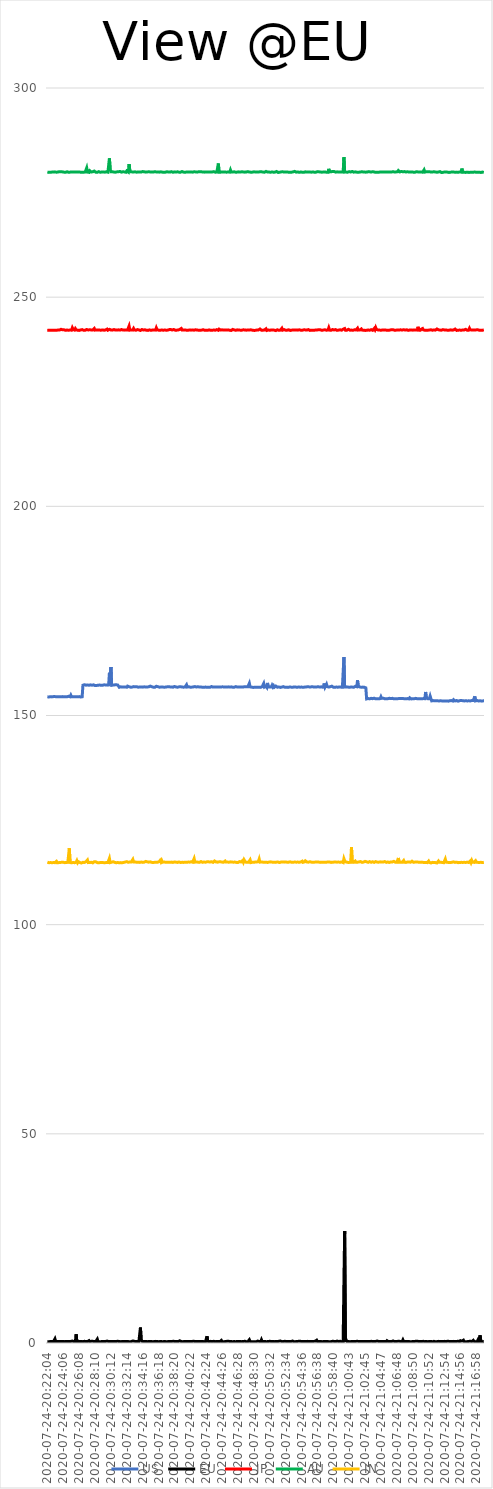
| Category | US | EU | JP | AU | IN |
|---|---|---|---|---|---|
| 2020-07-24-20:22:04 | 154.469 | 0.34 | 242.092 | 279.919 | 114.947 |
| 2020-07-24-20:22:10 | 154.546 | 0.378 | 242.149 | 279.965 | 114.862 |
| 2020-07-24-20:22:16 | 154.424 | 0.3 | 242.091 | 279.829 | 114.811 |
| 2020-07-24-20:22:22 | 154.582 | 0.306 | 242.114 | 279.846 | 114.849 |
| 2020-07-24-20:22:27 | 154.502 | 0.36 | 242.067 | 279.843 | 114.844 |
| 2020-07-24-20:22:33 | 154.479 | 0.297 | 242.162 | 279.893 | 114.92 |
| 2020-07-24-20:22:39 | 154.449 | 0.341 | 242.063 | 279.906 | 114.818 |
| 2020-07-24-20:22:45 | 154.559 | 0.316 | 242.123 | 279.864 | 114.794 |
| 2020-07-24-20:22:51 | 154.513 | 0.324 | 242.114 | 279.902 | 114.839 |
| 2020-07-24-20:22:57 | 154.743 | 0.363 | 242.196 | 279.869 | 114.819 |
| 2020-07-24-20:23:02 | 154.519 | 0.985 | 242.112 | 279.949 | 114.826 |
| 2020-07-24-20:23:08 | 154.496 | 0.32 | 242.196 | 279.995 | 114.856 |
| 2020-07-24-20:23:14 | 154.482 | 0.316 | 242.075 | 279.87 | 115.137 |
| 2020-07-24-20:23:20 | 154.445 | 0.356 | 242.063 | 279.885 | 114.801 |
| 2020-07-24-20:23:26 | 154.478 | 0.338 | 242.147 | 279.923 | 114.861 |
| 2020-07-24-20:23:31 | 154.446 | 0.338 | 242.252 | 279.978 | 114.831 |
| 2020-07-24-20:23:37 | 154.495 | 0.301 | 242.141 | 279.997 | 114.992 |
| 2020-07-24-20:23:43 | 154.528 | 0.337 | 242.167 | 279.948 | 114.867 |
| 2020-07-24-20:23:49 | 154.493 | 0.338 | 242.32 | 279.991 | 114.87 |
| 2020-07-24-20:23:55 | 154.533 | 0.365 | 242.097 | 279.842 | 114.912 |
| 2020-07-24-20:24:00 | 154.513 | 0.33 | 242.21 | 279.944 | 114.804 |
| 2020-07-24-20:24:06 | 154.57 | 0.351 | 242.056 | 279.991 | 114.912 |
| 2020-07-24-20:24:12 | 154.488 | 0.405 | 242.198 | 279.886 | 114.877 |
| 2020-07-24-20:24:18 | 154.508 | 0.324 | 242.107 | 279.926 | 114.821 |
| 2020-07-24-20:24:24 | 154.491 | 0.313 | 242.072 | 279.84 | 114.858 |
| 2020-07-24-20:24:29 | 154.508 | 0.371 | 242.253 | 279.937 | 114.862 |
| 2020-07-24-20:24:35 | 154.484 | 0.314 | 242.147 | 279.982 | 114.824 |
| 2020-07-24-20:24:41 | 154.561 | 0.351 | 242.186 | 279.889 | 114.902 |
| 2020-07-24-20:24:47 | 154.597 | 0.38 | 242.09 | 279.853 | 114.911 |
| 2020-07-24-20:24:53 | 154.565 | 0.346 | 242.155 | 279.854 | 118.265 |
| 2020-07-24-20:24:58 | 154.487 | 0.388 | 242.142 | 279.889 | 114.867 |
| 2020-07-24-20:25:04 | 154.866 | 0.374 | 242.244 | 279.959 | 114.802 |
| 2020-07-24-20:25:10 | 154.472 | 0.35 | 242.109 | 279.918 | 114.787 |
| 2020-07-24-20:25:16 | 154.549 | 0.468 | 242.67 | 279.9 | 114.889 |
| 2020-07-24-20:25:22 | 154.461 | 0.343 | 242.309 | 279.939 | 114.867 |
| 2020-07-24-20:25:28 | 154.558 | 0.341 | 242.174 | 279.914 | 114.81 |
| 2020-07-24-20:25:33 | 154.485 | 0.339 | 242.133 | 279.897 | 114.815 |
| 2020-07-24-20:25:39 | 154.51 | 0.368 | 242.482 | 280.017 | 114.869 |
| 2020-07-24-20:25:45 | 154.481 | 2.091 | 242.21 | 279.905 | 114.904 |
| 2020-07-24-20:25:51 | 154.575 | 0.363 | 242.052 | 279.892 | 115.296 |
| 2020-07-24-20:25:57 | 154.456 | 0.331 | 242.1 | 279.905 | 114.808 |
| 2020-07-24-20:26:02 | 154.509 | 0.336 | 242.186 | 279.9 | 115.066 |
| 2020-07-24-20:26:08 | 154.516 | 0.341 | 242.053 | 279.918 | 114.863 |
| 2020-07-24-20:26:14 | 154.527 | 0.368 | 242.067 | 279.914 | 114.848 |
| 2020-07-24-20:26:20 | 154.429 | 0.362 | 242.163 | 279.87 | 114.835 |
| 2020-07-24-20:26:26 | 154.463 | 0.354 | 242.123 | 279.911 | 114.742 |
| 2020-07-24-20:26:31 | 154.48 | 0.356 | 242.247 | 279.852 | 114.902 |
| 2020-07-24-20:26:37 | 157.24 | 0.323 | 242.077 | 279.895 | 114.898 |
| 2020-07-24-20:26:43 | 157.277 | 0.383 | 242.073 | 279.863 | 114.855 |
| 2020-07-24-20:26:49 | 157.356 | 0.399 | 242.227 | 279.871 | 114.878 |
| 2020-07-24-20:26:55 | 157.349 | 0.363 | 242.088 | 279.912 | 114.838 |
| 2020-07-24-20:27:00 | 157.238 | 0.366 | 242.115 | 279.888 | 115.037 |
| 2020-07-24-20:27:06 | 157.264 | 0.355 | 242.271 | 280.9 | 114.837 |
| 2020-07-24-20:27:12 | 157.307 | 0.324 | 242.21 | 279.901 | 115.468 |
| 2020-07-24-20:27:18 | 157.321 | 0.316 | 242.153 | 279.828 | 114.84 |
| 2020-07-24-20:27:24 | 157.229 | 0.557 | 242.105 | 279.837 | 114.885 |
| 2020-07-24-20:27:29 | 157.227 | 0.317 | 242.214 | 280.222 | 114.862 |
| 2020-07-24-20:27:35 | 157.319 | 0.345 | 242.086 | 279.994 | 114.813 |
| 2020-07-24-20:27:41 | 157.358 | 0.4 | 242.151 | 279.927 | 114.913 |
| 2020-07-24-20:27:47 | 157.236 | 0.359 | 242.155 | 279.905 | 114.778 |
| 2020-07-24-20:27:53 | 157.289 | 0.398 | 242.143 | 279.968 | 114.779 |
| 2020-07-24-20:27:59 | 157.327 | 0.318 | 242.13 | 279.897 | 114.847 |
| 2020-07-24-20:28:04 | 157.246 | 0.363 | 242.509 | 280.145 | 115.057 |
| 2020-07-24-20:28:10 | 157.156 | 0.354 | 242.125 | 279.917 | 114.839 |
| 2020-07-24-20:28:16 | 157.301 | 0.357 | 242.139 | 279.87 | 115.029 |
| 2020-07-24-20:28:22 | 157.182 | 0.386 | 242.148 | 279.941 | 114.843 |
| 2020-07-24-20:28:28 | 157.22 | 0.919 | 242.151 | 279.859 | 114.83 |
| 2020-07-24-20:28:33 | 157.243 | 0.31 | 242.129 | 279.913 | 114.842 |
| 2020-07-24-20:28:39 | 157.299 | 0.323 | 242.091 | 280.001 | 114.786 |
| 2020-07-24-20:28:45 | 157.276 | 0.317 | 242.13 | 279.887 | 114.892 |
| 2020-07-24-20:28:51 | 157.292 | 0.379 | 242.12 | 279.862 | 114.86 |
| 2020-07-24-20:28:57 | 157.232 | 0.329 | 242.107 | 279.929 | 114.833 |
| 2020-07-24-20:29:02 | 157.217 | 0.376 | 242.176 | 279.919 | 114.876 |
| 2020-07-24-20:29:08 | 157.226 | 0.331 | 242.164 | 279.964 | 114.853 |
| 2020-07-24-20:29:14 | 157.215 | 0.383 | 242.108 | 279.91 | 114.833 |
| 2020-07-24-20:29:20 | 157.337 | 0.338 | 242.103 | 279.862 | 114.825 |
| 2020-07-24-20:29:26 | 157.29 | 0.386 | 242.158 | 279.882 | 114.812 |
| 2020-07-24-20:29:32 | 157.297 | 0.37 | 242.162 | 279.881 | 114.952 |
| 2020-07-24-20:29:37 | 157.304 | 0.365 | 242.162 | 279.969 | 114.857 |
| 2020-07-24-20:29:43 | 157.261 | 0.459 | 242.365 | 279.953 | 114.813 |
| 2020-07-24-20:29:49 | 157.365 | 0.354 | 242.107 | 279.881 | 114.85 |
| 2020-07-24-20:29:55 | 157.306 | 0.343 | 242.171 | 279.961 | 114.836 |
| 2020-07-24-20:30:01 | 160.214 | 0.376 | 242.313 | 283.184 | 115.847 |
| 2020-07-24-20:30:06 | 157.228 | 0.385 | 242.179 | 280.537 | 114.838 |
| 2020-07-24-20:30:12 | 161.601 | 0.338 | 242.143 | 279.981 | 114.881 |
| 2020-07-24-20:30:18 | 157.216 | 0.376 | 242.109 | 280.061 | 114.937 |
| 2020-07-24-20:30:24 | 157.282 | 0.311 | 242.123 | 279.979 | 114.885 |
| 2020-07-24-20:30:30 | 157.279 | 0.34 | 242.063 | 279.89 | 115.046 |
| 2020-07-24-20:30:35 | 157.268 | 0.334 | 242.265 | 279.895 | 114.842 |
| 2020-07-24-20:30:41 | 157.321 | 0.358 | 242.072 | 279.94 | 114.89 |
| 2020-07-24-20:30:47 | 157.346 | 0.376 | 242.124 | 279.881 | 114.858 |
| 2020-07-24-20:30:53 | 157.346 | 0.371 | 242.302 | 280.095 | 114.806 |
| 2020-07-24-20:30:59 | 157.319 | 0.408 | 242.147 | 279.956 | 114.79 |
| 2020-07-24-20:31:04 | 157.29 | 0.412 | 242.285 | 280.113 | 114.856 |
| 2020-07-24-20:31:10 | 157.037 | 0.466 | 242.191 | 279.977 | 114.874 |
| 2020-07-24-20:31:16 | 156.738 | 0.341 | 242.16 | 279.894 | 114.795 |
| 2020-07-24-20:31:22 | 156.733 | 0.388 | 242.13 | 280.047 | 114.895 |
| 2020-07-24-20:31:28 | 156.855 | 0.326 | 242.055 | 279.919 | 114.834 |
| 2020-07-24-20:31:34 | 156.828 | 0.327 | 242.257 | 279.889 | 114.924 |
| 2020-07-24-20:31:39 | 156.788 | 0.332 | 242.209 | 279.997 | 114.816 |
| 2020-07-24-20:31:45 | 156.781 | 0.289 | 242.149 | 279.982 | 114.845 |
| 2020-07-24-20:31:51 | 156.816 | 0.345 | 242.18 | 279.9 | 114.888 |
| 2020-07-24-20:31:57 | 156.74 | 0.33 | 242.12 | 279.931 | 114.901 |
| 2020-07-24-20:32:03 | 156.829 | 0.362 | 242.142 | 279.906 | 114.973 |
| 2020-07-24-20:32:08 | 156.804 | 0.335 | 242.132 | 279.857 | 114.933 |
| 2020-07-24-20:32:14 | 156.759 | 0.339 | 242.192 | 280.185 | 115.064 |
| 2020-07-24-20:32:20 | 157.017 | 0.311 | 242.131 | 279.979 | 114.96 |
| 2020-07-24-20:32:26 | 156.915 | 0.339 | 242.075 | 279.913 | 114.909 |
| 2020-07-24-20:32:32 | 156.88 | 0.426 | 243.077 | 281.805 | 114.931 |
| 2020-07-24-20:32:37 | 156.726 | 0.289 | 242.118 | 280.253 | 114.976 |
| 2020-07-24-20:32:43 | 156.778 | 0.317 | 242.154 | 279.979 | 114.932 |
| 2020-07-24-20:32:49 | 156.792 | 0.341 | 242.175 | 279.901 | 115.001 |
| 2020-07-24-20:32:55 | 156.784 | 0.296 | 242.082 | 279.943 | 114.943 |
| 2020-07-24-20:33:01 | 156.846 | 0.49 | 242.138 | 280.097 | 115.6 |
| 2020-07-24-20:33:07 | 156.905 | 0.36 | 242.507 | 279.932 | 114.992 |
| 2020-07-24-20:33:12 | 156.823 | 0.394 | 242.179 | 280.018 | 114.9 |
| 2020-07-24-20:33:18 | 156.875 | 0.387 | 242.194 | 279.961 | 114.999 |
| 2020-07-24-20:33:24 | 156.753 | 0.338 | 242.091 | 279.93 | 114.906 |
| 2020-07-24-20:33:30 | 156.898 | 0.366 | 242.185 | 279.876 | 114.907 |
| 2020-07-24-20:33:36 | 156.781 | 0.332 | 242.254 | 279.922 | 114.913 |
| 2020-07-24-20:33:41 | 156.771 | 0.341 | 242.122 | 279.914 | 114.934 |
| 2020-07-24-20:33:47 | 156.794 | 0.355 | 242.161 | 279.933 | 114.884 |
| 2020-07-24-20:33:53 | 156.799 | 0.354 | 242.037 | 279.925 | 114.886 |
| 2020-07-24-20:33:59 | 156.846 | 3.688 | 242.036 | 279.932 | 114.991 |
| 2020-07-24-20:34:05 | 156.832 | 0.733 | 242.152 | 279.908 | 114.969 |
| 2020-07-24-20:34:10 | 156.805 | 0.394 | 242.262 | 279.97 | 114.952 |
| 2020-07-24-20:34:16 | 156.781 | 0.387 | 242.18 | 280.028 | 114.894 |
| 2020-07-24-20:34:22 | 156.851 | 0.372 | 242.144 | 279.88 | 114.998 |
| 2020-07-24-20:34:28 | 156.855 | 0.303 | 242.095 | 279.974 | 114.944 |
| 2020-07-24-20:34:34 | 156.817 | 0.364 | 242.199 | 279.904 | 114.95 |
| 2020-07-24-20:34:39 | 156.795 | 0.305 | 242.144 | 279.889 | 115.117 |
| 2020-07-24-20:34:45 | 156.817 | 0.34 | 242.076 | 279.982 | 114.948 |
| 2020-07-24-20:34:51 | 156.821 | 0.377 | 242.097 | 279.932 | 115.021 |
| 2020-07-24-20:34:57 | 156.8 | 0.321 | 242.058 | 279.947 | 114.91 |
| 2020-07-24-20:35:03 | 156.855 | 0.443 | 242.076 | 279.982 | 114.939 |
| 2020-07-24-20:35:09 | 156.845 | 0.382 | 242.177 | 279.897 | 114.929 |
| 2020-07-24-20:35:14 | 157.024 | 0.308 | 242.016 | 279.923 | 115.018 |
| 2020-07-24-20:35:20 | 156.819 | 0.356 | 242.069 | 279.906 | 114.916 |
| 2020-07-24-20:35:26 | 156.868 | 0.402 | 242.221 | 279.909 | 114.892 |
| 2020-07-24-20:35:32 | 156.87 | 0.322 | 242.151 | 279.864 | 115.035 |
| 2020-07-24-20:35:38 | 156.774 | 0.372 | 242.208 | 279.911 | 114.868 |
| 2020-07-24-20:35:43 | 156.787 | 0.332 | 242.159 | 279.884 | 115.093 |
| 2020-07-24-20:35:49 | 156.741 | 0.353 | 242.101 | 279.993 | 114.904 |
| 2020-07-24-20:35:55 | 156.817 | 0.388 | 242.125 | 279.885 | 114.967 |
| 2020-07-24-20:36:01 | 156.988 | 0.392 | 242.668 | 279.929 | 114.947 |
| 2020-07-24-20:36:07 | 156.814 | 0.351 | 242.236 | 279.89 | 114.965 |
| 2020-07-24-20:36:12 | 156.887 | 0.383 | 242.169 | 279.927 | 114.939 |
| 2020-07-24-20:36:18 | 156.825 | 0.318 | 242.108 | 279.858 | 114.995 |
| 2020-07-24-20:36:24 | 156.768 | 0.312 | 242.109 | 279.885 | 115.106 |
| 2020-07-24-20:36:30 | 156.834 | 0.343 | 242.094 | 279.945 | 115.352 |
| 2020-07-24-20:36:36 | 156.792 | 0.371 | 242.125 | 279.962 | 114.997 |
| 2020-07-24-20:36:42 | 156.837 | 0.333 | 242.153 | 279.883 | 115.356 |
| 2020-07-24-20:36:47 | 156.815 | 0.325 | 242.105 | 279.89 | 114.904 |
| 2020-07-24-20:36:53 | 156.788 | 0.314 | 242.102 | 279.914 | 115.01 |
| 2020-07-24-20:36:59 | 156.771 | 0.352 | 242.089 | 279.865 | 114.988 |
| 2020-07-24-20:37:05 | 156.831 | 0.38 | 242.138 | 279.941 | 114.944 |
| 2020-07-24-20:37:11 | 156.785 | 0.412 | 242.116 | 279.876 | 114.927 |
| 2020-07-24-20:37:16 | 156.846 | 0.307 | 242.111 | 279.891 | 114.958 |
| 2020-07-24-20:37:22 | 156.846 | 0.302 | 242.161 | 279.983 | 114.892 |
| 2020-07-24-20:37:28 | 156.843 | 0.328 | 242.123 | 279.921 | 114.929 |
| 2020-07-24-20:37:34 | 156.883 | 0.296 | 242.139 | 279.922 | 114.916 |
| 2020-07-24-20:37:40 | 156.837 | 0.333 | 242.242 | 279.915 | 115.153 |
| 2020-07-24-20:37:45 | 156.842 | 0.339 | 242.145 | 279.9 | 114.91 |
| 2020-07-24-20:37:51 | 156.802 | 0.349 | 242.273 | 279.911 | 114.86 |
| 2020-07-24-20:37:57 | 156.838 | 0.395 | 242.146 | 280 | 114.953 |
| 2020-07-24-20:38:03 | 156.862 | 0.383 | 242.15 | 279.899 | 115.06 |
| 2020-07-24-20:38:09 | 156.77 | 0.305 | 242.222 | 279.85 | 114.88 |
| 2020-07-24-20:38:14 | 156.819 | 0.404 | 242.274 | 279.911 | 114.957 |
| 2020-07-24-20:38:20 | 156.933 | 0.347 | 242.088 | 279.95 | 114.976 |
| 2020-07-24-20:38:26 | 156.91 | 0.32 | 242.111 | 279.919 | 115.048 |
| 2020-07-24-20:38:32 | 156.825 | 0.333 | 242.057 | 279.898 | 114.942 |
| 2020-07-24-20:38:38 | 156.795 | 0.374 | 242.115 | 279.965 | 114.987 |
| 2020-07-24-20:38:44 | 156.756 | 0.445 | 242.206 | 279.967 | 114.88 |
| 2020-07-24-20:38:49 | 156.88 | 0.334 | 242.16 | 279.99 | 114.913 |
| 2020-07-24-20:38:55 | 156.85 | 0.341 | 242.231 | 279.883 | 114.994 |
| 2020-07-24-20:39:01 | 156.817 | 0.535 | 242.288 | 280.087 | 114.916 |
| 2020-07-24-20:39:07 | 156.884 | 0.349 | 242.101 | 279.875 | 114.875 |
| 2020-07-24-20:39:13 | 156.821 | 0.351 | 242.512 | 279.881 | 115.071 |
| 2020-07-24-20:39:18 | 156.806 | 0.354 | 242.169 | 280.035 | 114.898 |
| 2020-07-24-20:39:24 | 156.827 | 0.316 | 242.11 | 279.895 | 114.912 |
| 2020-07-24-20:39:30 | 156.77 | 0.43 | 242.176 | 279.889 | 114.884 |
| 2020-07-24-20:39:36 | 156.839 | 0.354 | 242.214 | 279.892 | 114.944 |
| 2020-07-24-20:39:42 | 156.817 | 0.298 | 242.162 | 279.857 | 114.939 |
| 2020-07-24-20:39:47 | 156.793 | 0.333 | 242.07 | 280.027 | 114.948 |
| 2020-07-24-20:39:53 | 157.349 | 0.294 | 242.106 | 279.922 | 114.895 |
| 2020-07-24-20:39:59 | 156.799 | 0.344 | 242.175 | 279.894 | 114.913 |
| 2020-07-24-20:40:05 | 156.9 | 0.375 | 242.108 | 279.917 | 114.961 |
| 2020-07-24-20:40:11 | 156.869 | 0.343 | 242.184 | 279.918 | 114.966 |
| 2020-07-24-20:40:16 | 156.846 | 0.32 | 242.147 | 279.92 | 114.944 |
| 2020-07-24-20:40:22 | 156.769 | 0.335 | 242.076 | 279.91 | 114.961 |
| 2020-07-24-20:40:28 | 156.816 | 0.332 | 242.117 | 279.897 | 115.032 |
| 2020-07-24-20:40:34 | 156.783 | 0.346 | 242.146 | 279.907 | 114.935 |
| 2020-07-24-20:40:40 | 156.85 | 0.453 | 242.151 | 279.888 | 114.925 |
| 2020-07-24-20:40:46 | 156.837 | 0.432 | 242.144 | 279.917 | 114.985 |
| 2020-07-24-20:40:51 | 156.806 | 0.379 | 242.109 | 279.97 | 115.801 |
| 2020-07-24-20:40:57 | 156.915 | 0.354 | 242.25 | 279.93 | 114.945 |
| 2020-07-24-20:41:03 | 156.802 | 0.42 | 242.209 | 279.944 | 114.977 |
| 2020-07-24-20:41:09 | 156.815 | 0.357 | 242.174 | 279.914 | 114.991 |
| 2020-07-24-20:41:15 | 156.783 | 0.366 | 242.135 | 279.891 | 114.999 |
| 2020-07-24-20:41:20 | 156.871 | 0.368 | 242.186 | 279.952 | 114.939 |
| 2020-07-24-20:41:26 | 156.87 | 0.349 | 242.104 | 279.984 | 114.957 |
| 2020-07-24-20:41:32 | 156.816 | 0.341 | 242.086 | 279.852 | 114.897 |
| 2020-07-24-20:41:38 | 156.857 | 0.31 | 242.094 | 280.006 | 114.869 |
| 2020-07-24-20:41:44 | 156.805 | 0.366 | 242.175 | 279.892 | 115.087 |
| 2020-07-24-20:41:49 | 156.822 | 0.34 | 242.124 | 279.953 | 114.975 |
| 2020-07-24-20:41:55 | 156.759 | 0.375 | 242.119 | 279.992 | 114.897 |
| 2020-07-24-20:42:01 | 156.996 | 0.438 | 242.226 | 279.918 | 114.941 |
| 2020-07-24-20:42:07 | 156.743 | 0.321 | 242.16 | 279.851 | 114.979 |
| 2020-07-24-20:42:13 | 156.743 | 0.308 | 242.074 | 279.888 | 114.845 |
| 2020-07-24-20:42:18 | 156.792 | 0.316 | 242.2 | 279.919 | 114.922 |
| 2020-07-24-20:42:24 | 156.774 | 0.38 | 242.093 | 279.939 | 114.904 |
| 2020-07-24-20:42:30 | 156.749 | 1.618 | 242.154 | 279.863 | 115.023 |
| 2020-07-24-20:42:36 | 156.802 | 0.396 | 242.096 | 279.947 | 114.956 |
| 2020-07-24-20:42:42 | 156.75 | 0.396 | 242.142 | 279.921 | 115.017 |
| 2020-07-24-20:42:48 | 156.82 | 0.34 | 242.175 | 279.924 | 115.03 |
| 2020-07-24-20:42:53 | 156.747 | 0.36 | 242.199 | 279.964 | 114.976 |
| 2020-07-24-20:42:59 | 156.781 | 0.394 | 242.073 | 279.945 | 114.965 |
| 2020-07-24-20:43:05 | 156.921 | 0.369 | 242.106 | 279.919 | 115.048 |
| 2020-07-24-20:43:11 | 156.81 | 0.361 | 242.096 | 279.938 | 115.166 |
| 2020-07-24-20:43:17 | 156.784 | 0.324 | 242.19 | 279.924 | 114.892 |
| 2020-07-24-20:43:22 | 156.796 | 0.402 | 242.15 | 280.01 | 114.999 |
| 2020-07-24-20:43:28 | 156.836 | 0.332 | 242.058 | 279.924 | 115.224 |
| 2020-07-24-20:43:34 | 156.808 | 0.316 | 242.099 | 279.874 | 115.189 |
| 2020-07-24-20:43:40 | 156.825 | 0.398 | 242.176 | 279.895 | 114.99 |
| 2020-07-24-20:43:46 | 156.793 | 0.372 | 242.236 | 279.9 | 114.893 |
| 2020-07-24-20:43:51 | 156.839 | 0.301 | 242.108 | 279.988 | 114.942 |
| 2020-07-24-20:43:57 | 156.74 | 0.339 | 242.092 | 281.949 | 114.932 |
| 2020-07-24-20:44:03 | 156.8 | 0.32 | 242.354 | 279.859 | 115.025 |
| 2020-07-24-20:44:09 | 156.855 | 0.327 | 242.225 | 279.916 | 114.985 |
| 2020-07-24-20:44:15 | 156.802 | 0.354 | 242.15 | 279.884 | 115.016 |
| 2020-07-24-20:44:21 | 156.822 | 0.62 | 242.158 | 279.933 | 114.893 |
| 2020-07-24-20:44:26 | 156.845 | 0.292 | 242.193 | 279.934 | 114.953 |
| 2020-07-24-20:44:32 | 156.744 | 0.316 | 242.06 | 279.938 | 115.004 |
| 2020-07-24-20:44:38 | 156.84 | 0.307 | 242.135 | 279.924 | 114.931 |
| 2020-07-24-20:44:44 | 156.747 | 0.332 | 242.204 | 279.964 | 114.972 |
| 2020-07-24-20:44:50 | 156.818 | 0.34 | 242.175 | 279.898 | 115.215 |
| 2020-07-24-20:44:55 | 156.796 | 0.307 | 242.155 | 279.951 | 114.962 |
| 2020-07-24-20:45:01 | 156.799 | 0.394 | 242.128 | 279.883 | 115.035 |
| 2020-07-24-20:45:07 | 156.801 | 0.298 | 242.121 | 279.856 | 114.979 |
| 2020-07-24-20:45:13 | 156.847 | 0.425 | 242.179 | 279.944 | 114.995 |
| 2020-07-24-20:45:19 | 156.789 | 0.306 | 242.122 | 279.866 | 114.924 |
| 2020-07-24-20:45:24 | 156.788 | 0.372 | 242.084 | 279.884 | 114.886 |
| 2020-07-24-20:45:30 | 156.763 | 0.365 | 242.173 | 280.406 | 115.013 |
| 2020-07-24-20:45:36 | 156.847 | 0.341 | 242.04 | 279.909 | 114.889 |
| 2020-07-24-20:45:42 | 156.898 | 0.36 | 242.139 | 279.937 | 114.955 |
| 2020-07-24-20:45:48 | 156.769 | 0.318 | 242.284 | 279.931 | 114.904 |
| 2020-07-24-20:45:53 | 156.756 | 0.304 | 242.055 | 279.934 | 114.943 |
| 2020-07-24-20:45:59 | 156.763 | 0.342 | 242.173 | 279.964 | 114.966 |
| 2020-07-24-20:46:05 | 156.855 | 0.362 | 242.055 | 279.901 | 114.958 |
| 2020-07-24-20:46:11 | 156.903 | 0.308 | 242.092 | 279.868 | 114.87 |
| 2020-07-24-20:46:17 | 156.708 | 0.344 | 242.168 | 280.026 | 114.882 |
| 2020-07-24-20:46:23 | 156.815 | 0.372 | 242.183 | 279.898 | 114.981 |
| 2020-07-24-20:46:28 | 156.88 | 0.338 | 242.118 | 279.93 | 114.88 |
| 2020-07-24-20:46:34 | 156.8 | 0.375 | 242.135 | 279.956 | 114.968 |
| 2020-07-24-20:46:40 | 156.806 | 0.367 | 242.156 | 279.869 | 115.077 |
| 2020-07-24-20:46:46 | 156.792 | 0.36 | 242.117 | 279.901 | 114.93 |
| 2020-07-24-20:46:52 | 156.965 | 0.315 | 242.135 | 279.884 | 114.989 |
| 2020-07-24-20:46:57 | 156.784 | 0.318 | 242.107 | 279.966 | 114.929 |
| 2020-07-24-20:47:03 | 156.746 | 0.422 | 242.209 | 279.909 | 115.318 |
| 2020-07-24-20:47:09 | 156.818 | 0.359 | 242.192 | 279.935 | 114.935 |
| 2020-07-24-20:47:15 | 156.78 | 0.378 | 242.137 | 279.842 | 115.513 |
| 2020-07-24-20:47:21 | 156.9 | 0.419 | 242.169 | 279.882 | 115.206 |
| 2020-07-24-20:47:26 | 156.765 | 0.401 | 242.206 | 279.937 | 114.958 |
| 2020-07-24-20:47:32 | 156.852 | 0.293 | 242.106 | 279.928 | 115.057 |
| 2020-07-24-20:47:38 | 156.883 | 0.401 | 242.153 | 279.837 | 114.893 |
| 2020-07-24-20:47:44 | 156.852 | 0.316 | 242.173 | 280.004 | 115.002 |
| 2020-07-24-20:47:50 | 156.857 | 0.306 | 242.27 | 279.919 | 114.922 |
| 2020-07-24-20:47:55 | 157.701 | 0.785 | 242.145 | 279.911 | 114.946 |
| 2020-07-24-20:48:01 | 156.845 | 0.378 | 242.108 | 279.995 | 115.492 |
| 2020-07-24-20:48:07 | 156.766 | 0.341 | 242.197 | 279.878 | 114.84 |
| 2020-07-24-20:48:13 | 156.78 | 0.301 | 242.126 | 279.916 | 114.95 |
| 2020-07-24-20:48:19 | 156.816 | 0.36 | 242.102 | 279.889 | 114.919 |
| 2020-07-24-20:48:25 | 156.706 | 0.322 | 242.103 | 279.884 | 114.944 |
| 2020-07-24-20:48:30 | 156.802 | 0.358 | 242.056 | 279.966 | 114.897 |
| 2020-07-24-20:48:36 | 156.769 | 0.327 | 242.133 | 279.896 | 114.979 |
| 2020-07-24-20:48:42 | 156.754 | 0.309 | 242.064 | 279.924 | 114.986 |
| 2020-07-24-20:48:48 | 156.747 | 0.297 | 242.275 | 279.927 | 114.944 |
| 2020-07-24-20:48:54 | 156.806 | 0.359 | 242.156 | 279.908 | 114.98 |
| 2020-07-24-20:48:59 | 156.779 | 0.456 | 242.12 | 279.917 | 114.947 |
| 2020-07-24-20:49:05 | 156.779 | 0.369 | 242.151 | 279.911 | 115.127 |
| 2020-07-24-20:49:11 | 156.77 | 0.368 | 242.072 | 279.91 | 115.685 |
| 2020-07-24-20:49:17 | 156.867 | 0.325 | 242.391 | 279.977 | 114.942 |
| 2020-07-24-20:49:23 | 156.727 | 0.322 | 242.213 | 279.874 | 114.92 |
| 2020-07-24-20:49:28 | 156.741 | 0.768 | 242.107 | 279.97 | 114.987 |
| 2020-07-24-20:49:34 | 156.903 | 0.323 | 242.133 | 279.937 | 114.986 |
| 2020-07-24-20:49:40 | 156.815 | 0.333 | 242.111 | 279.896 | 114.94 |
| 2020-07-24-20:49:46 | 157.659 | 0.35 | 242.094 | 279.904 | 114.941 |
| 2020-07-24-20:49:52 | 156.789 | 0.414 | 242.156 | 279.875 | 114.94 |
| 2020-07-24-20:49:57 | 156.838 | 0.335 | 242.11 | 279.957 | 114.937 |
| 2020-07-24-20:50:03 | 156.973 | 0.516 | 242.435 | 280.054 | 114.939 |
| 2020-07-24-20:50:09 | 156.727 | 0.323 | 242.045 | 279.871 | 114.932 |
| 2020-07-24-20:50:15 | 157.787 | 0.399 | 242.105 | 279.91 | 114.874 |
| 2020-07-24-20:50:21 | 156.829 | 0.349 | 242.165 | 279.908 | 115.04 |
| 2020-07-24-20:50:27 | 156.804 | 0.358 | 242.207 | 279.906 | 114.957 |
| 2020-07-24-20:50:32 | 156.836 | 0.42 | 242.079 | 280.015 | 115.147 |
| 2020-07-24-20:50:38 | 156.781 | 0.391 | 242.092 | 279.86 | 115.014 |
| 2020-07-24-20:50:44 | 156.836 | 0.334 | 242.167 | 279.925 | 114.899 |
| 2020-07-24-20:50:50 | 157.227 | 0.354 | 242.224 | 279.94 | 114.949 |
| 2020-07-24-20:50:56 | 156.841 | 0.364 | 242.173 | 279.843 | 114.902 |
| 2020-07-24-20:51:01 | 157.113 | 0.359 | 242.176 | 279.874 | 114.928 |
| 2020-07-24-20:51:07 | 156.751 | 0.327 | 242.108 | 279.913 | 114.926 |
| 2020-07-24-20:51:13 | 156.839 | 0.391 | 242.146 | 279.897 | 114.889 |
| 2020-07-24-20:51:19 | 157.036 | 0.344 | 242.011 | 279.893 | 115.09 |
| 2020-07-24-20:51:25 | 156.826 | 0.328 | 242.138 | 280.04 | 114.953 |
| 2020-07-24-20:51:30 | 156.769 | 0.328 | 242.205 | 279.917 | 114.883 |
| 2020-07-24-20:51:36 | 156.83 | 0.344 | 242.124 | 279.813 | 114.958 |
| 2020-07-24-20:51:42 | 156.816 | 0.407 | 242.078 | 279.973 | 115.052 |
| 2020-07-24-20:51:48 | 156.867 | 0.312 | 242.138 | 279.86 | 114.85 |
| 2020-07-24-20:51:54 | 156.716 | 0.486 | 242.118 | 279.806 | 114.934 |
| 2020-07-24-20:52:00 | 156.761 | 0.457 | 242.164 | 279.944 | 114.978 |
| 2020-07-24-20:52:05 | 156.799 | 0.318 | 242.575 | 279.996 | 114.889 |
| 2020-07-24-20:52:11 | 156.832 | 0.349 | 242.12 | 279.964 | 114.967 |
| 2020-07-24-20:52:17 | 156.902 | 0.35 | 242.182 | 279.894 | 114.995 |
| 2020-07-24-20:52:23 | 156.815 | 0.329 | 242.244 | 279.914 | 114.949 |
| 2020-07-24-20:52:29 | 156.738 | 0.404 | 242.28 | 279.857 | 115.018 |
| 2020-07-24-20:52:34 | 156.784 | 0.35 | 242.102 | 279.907 | 114.996 |
| 2020-07-24-20:52:40 | 156.777 | 0.353 | 242.144 | 279.949 | 115.064 |
| 2020-07-24-20:52:46 | 156.777 | 0.296 | 242.115 | 279.924 | 114.928 |
| 2020-07-24-20:52:52 | 156.718 | 0.329 | 242.181 | 279.946 | 114.901 |
| 2020-07-24-20:52:58 | 156.812 | 0.358 | 242.2 | 279.862 | 114.947 |
| 2020-07-24-20:53:03 | 156.795 | 0.358 | 242.108 | 279.946 | 115.106 |
| 2020-07-24-20:53:09 | 156.786 | 0.374 | 242.048 | 279.879 | 115.019 |
| 2020-07-24-20:53:15 | 156.784 | 0.333 | 242.175 | 279.912 | 114.939 |
| 2020-07-24-20:53:21 | 156.84 | 0.414 | 242.114 | 279.877 | 114.907 |
| 2020-07-24-20:53:27 | 156.734 | 0.473 | 242.165 | 279.959 | 115.116 |
| 2020-07-24-20:53:32 | 156.762 | 0.338 | 242.162 | 279.966 | 114.934 |
| 2020-07-24-20:53:38 | 156.831 | 0.325 | 242.13 | 279.864 | 114.944 |
| 2020-07-24-20:53:44 | 156.798 | 0.293 | 242.162 | 280.066 | 114.964 |
| 2020-07-24-20:53:50 | 156.82 | 0.322 | 242.13 | 279.946 | 114.879 |
| 2020-07-24-20:53:56 | 156.827 | 0.334 | 242.141 | 279.886 | 114.944 |
| 2020-07-24-20:54:02 | 156.731 | 0.384 | 242.135 | 280.017 | 114.923 |
| 2020-07-24-20:54:07 | 156.754 | 0.372 | 242.121 | 279.933 | 114.956 |
| 2020-07-24-20:54:13 | 156.827 | 0.39 | 242.22 | 279.863 | 114.943 |
| 2020-07-24-20:54:19 | 156.849 | 0.315 | 242.205 | 279.839 | 114.927 |
| 2020-07-24-20:54:25 | 156.769 | 0.436 | 242.181 | 279.907 | 114.999 |
| 2020-07-24-20:54:31 | 156.892 | 0.409 | 242.105 | 279.92 | 114.978 |
| 2020-07-24-20:54:36 | 156.8 | 0.34 | 242.149 | 280.034 | 114.884 |
| 2020-07-24-20:54:42 | 156.82 | 0.321 | 242.106 | 279.858 | 115.184 |
| 2020-07-24-20:54:48 | 156.734 | 0.373 | 242.164 | 279.884 | 114.904 |
| 2020-07-24-20:54:54 | 156.771 | 0.338 | 242.193 | 279.832 | 114.942 |
| 2020-07-24-20:55:00 | 156.788 | 0.328 | 242.147 | 279.89 | 115.02 |
| 2020-07-24-20:55:05 | 156.976 | 0.423 | 242.177 | 279.967 | 115.263 |
| 2020-07-24-20:55:11 | 156.826 | 0.364 | 242.144 | 279.923 | 115.037 |
| 2020-07-24-20:55:17 | 156.88 | 0.542 | 242.13 | 279.9 | 114.979 |
| 2020-07-24-20:55:23 | 156.867 | 0.392 | 242.073 | 279.878 | 114.937 |
| 2020-07-24-20:55:29 | 156.814 | 0.389 | 242.244 | 279.928 | 114.929 |
| 2020-07-24-20:55:34 | 156.841 | 0.323 | 242.057 | 279.908 | 114.946 |
| 2020-07-24-20:55:40 | 156.754 | 0.326 | 242.057 | 279.898 | 115.049 |
| 2020-07-24-20:55:46 | 156.815 | 0.38 | 242.125 | 279.887 | 114.908 |
| 2020-07-24-20:55:52 | 156.798 | 0.335 | 242.076 | 279.885 | 114.949 |
| 2020-07-24-20:55:58 | 156.89 | 0.358 | 242.151 | 279.911 | 114.937 |
| 2020-07-24-20:56:04 | 156.781 | 0.37 | 242.078 | 279.928 | 114.907 |
| 2020-07-24-20:56:09 | 156.82 | 0.386 | 242.061 | 279.91 | 114.967 |
| 2020-07-24-20:56:15 | 156.745 | 0.371 | 242.102 | 279.867 | 114.943 |
| 2020-07-24-20:56:21 | 156.785 | 0.395 | 242.161 | 279.941 | 114.922 |
| 2020-07-24-20:56:27 | 156.827 | 0.322 | 242.173 | 279.884 | 114.974 |
| 2020-07-24-20:56:33 | 156.82 | 0.665 | 242.115 | 279.967 | 114.898 |
| 2020-07-24-20:56:38 | 156.751 | 0.34 | 242.173 | 280.011 | 114.965 |
| 2020-07-24-20:56:44 | 156.882 | 0.362 | 242.131 | 279.946 | 114.937 |
| 2020-07-24-20:56:50 | 156.784 | 0.345 | 242.22 | 279.96 | 114.951 |
| 2020-07-24-20:56:56 | 156.79 | 0.413 | 242.185 | 279.835 | 115.185 |
| 2020-07-24-20:57:02 | 156.874 | 0.364 | 242.189 | 279.922 | 114.891 |
| 2020-07-24-20:57:07 | 156.856 | 0.33 | 242.144 | 279.897 | 114.903 |
| 2020-07-24-20:57:13 | 156.876 | 0.314 | 242.074 | 279.869 | 114.947 |
| 2020-07-24-20:57:19 | 156.768 | 0.327 | 242.106 | 279.838 | 114.932 |
| 2020-07-24-20:57:25 | 157.022 | 0.337 | 242.156 | 279.93 | 114.949 |
| 2020-07-24-20:57:31 | 157.66 | 0.306 | 242.128 | 279.878 | 114.973 |
| 2020-07-24-20:57:37 | 156.785 | 0.348 | 242.204 | 279.904 | 114.895 |
| 2020-07-24-20:57:42 | 156.874 | 0.343 | 242.195 | 279.877 | 114.993 |
| 2020-07-24-20:57:48 | 157.482 | 0.328 | 242.093 | 279.881 | 114.941 |
| 2020-07-24-20:57:54 | 156.892 | 0.324 | 242.138 | 279.922 | 114.896 |
| 2020-07-24-20:58:00 | 156.755 | 0.335 | 242.178 | 279.851 | 114.989 |
| 2020-07-24-20:58:06 | 156.802 | 0.433 | 242.688 | 280.676 | 114.955 |
| 2020-07-24-20:58:11 | 156.772 | 0.313 | 242.121 | 279.975 | 114.986 |
| 2020-07-24-20:58:17 | 156.885 | 0.312 | 242.222 | 279.94 | 115.211 |
| 2020-07-24-20:58:23 | 156.876 | 0.33 | 242.086 | 279.969 | 114.882 |
| 2020-07-24-20:58:29 | 157.012 | 0.335 | 242.198 | 279.884 | 114.988 |
| 2020-07-24-20:58:35 | 156.833 | 0.409 | 242.263 | 280.052 | 114.94 |
| 2020-07-24-20:58:40 | 156.773 | 0.306 | 242.128 | 280.008 | 114.98 |
| 2020-07-24-20:58:46 | 156.829 | 0.378 | 242.162 | 280.049 | 114.954 |
| 2020-07-24-20:58:52 | 156.759 | 0.372 | 242.228 | 279.949 | 114.974 |
| 2020-07-24-20:58:58 | 156.832 | 0.317 | 242.245 | 279.891 | 114.955 |
| 2020-07-24-20:59:04 | 156.792 | 0.404 | 242.156 | 279.944 | 114.97 |
| 2020-07-24-20:59:09 | 156.764 | 0.454 | 242.068 | 279.957 | 114.946 |
| 2020-07-24-20:59:15 | 156.773 | 0.331 | 242.088 | 279.949 | 115.055 |
| 2020-07-24-20:59:21 | 156.796 | 0.33 | 242.133 | 279.905 | 114.963 |
| 2020-07-24-20:59:27 | 156.801 | 0.335 | 242.031 | 279.936 | 114.972 |
| 2020-07-24-20:59:33 | 156.895 | 0.411 | 242.212 | 279.939 | 114.913 |
| 2020-07-24-20:59:39 | 156.782 | 0.373 | 242.083 | 279.993 | 114.833 |
| 2020-07-24-20:59:44 | 156.765 | 0.289 | 242.107 | 279.894 | 114.998 |
| 2020-07-24-20:59:50 | 156.78 | 0.336 | 242.125 | 279.964 | 114.932 |
| 2020-07-24-20:59:56 | 156.906 | 0.306 | 242.343 | 279.907 | 114.839 |
| 2020-07-24-21:00:02 | 163.964 | 14.556 | 242.432 | 283.473 | 115.773 |
| 2020-07-24-21:00:08 | 156.811 | 26.777 | 242.499 | 279.906 | 115.273 |
| 2020-07-24-21:00:13 | 156.82 | 0.329 | 242.092 | 279.886 | 115.017 |
| 2020-07-24-21:00:19 | 156.801 | 0.745 | 242.109 | 279.891 | 114.911 |
| 2020-07-24-21:00:25 | 156.812 | 0.355 | 242.109 | 279.941 | 114.94 |
| 2020-07-24-21:00:31 | 156.807 | 0.352 | 242.107 | 279.886 | 114.953 |
| 2020-07-24-21:00:37 | 156.842 | 0.355 | 242.313 | 279.931 | 114.857 |
| 2020-07-24-21:00:43 | 156.75 | 0.484 | 242.154 | 280.006 | 114.943 |
| 2020-07-24-21:00:48 | 156.845 | 0.313 | 242.119 | 279.945 | 114.904 |
| 2020-07-24-21:00:54 | 156.791 | 0.385 | 242.202 | 279.917 | 115.168 |
| 2020-07-24-21:01:00 | 156.851 | 0.357 | 242.123 | 279.878 | 118.515 |
| 2020-07-24-21:01:06 | 156.79 | 0.446 | 242.17 | 280.045 | 114.92 |
| 2020-07-24-21:01:12 | 156.762 | 0.377 | 242.09 | 279.987 | 114.921 |
| 2020-07-24-21:01:17 | 156.751 | 0.294 | 242.134 | 279.88 | 114.891 |
| 2020-07-24-21:01:23 | 156.935 | 0.319 | 242.198 | 279.852 | 114.939 |
| 2020-07-24-21:01:29 | 156.964 | 0.363 | 242.088 | 279.954 | 115.204 |
| 2020-07-24-21:01:35 | 156.762 | 0.387 | 242.164 | 279.854 | 114.945 |
| 2020-07-24-21:01:41 | 156.88 | 0.376 | 242.169 | 279.884 | 114.902 |
| 2020-07-24-21:01:46 | 158.42 | 0.394 | 242.587 | 280.023 | 114.934 |
| 2020-07-24-21:01:52 | 156.927 | 0.307 | 242.124 | 279.849 | 115.009 |
| 2020-07-24-21:01:58 | 156.805 | 0.372 | 242.09 | 279.942 | 114.998 |
| 2020-07-24-21:02:04 | 156.81 | 0.353 | 242.136 | 279.907 | 114.903 |
| 2020-07-24-21:02:10 | 156.773 | 0.342 | 242.175 | 279.925 | 115.075 |
| 2020-07-24-21:02:16 | 156.754 | 0.32 | 242.399 | 279.955 | 114.87 |
| 2020-07-24-21:02:21 | 156.753 | 0.348 | 242.13 | 279.887 | 114.892 |
| 2020-07-24-21:02:27 | 156.788 | 0.366 | 242.138 | 279.949 | 114.911 |
| 2020-07-24-21:02:33 | 156.86 | 0.356 | 242.102 | 279.918 | 114.966 |
| 2020-07-24-21:02:39 | 156.755 | 0.368 | 242.17 | 279.911 | 115.026 |
| 2020-07-24-21:02:45 | 156.746 | 0.384 | 242.051 | 280.011 | 115.129 |
| 2020-07-24-21:02:50 | 156.602 | 0.38 | 242.063 | 279.882 | 114.998 |
| 2020-07-24-21:02:56 | 153.967 | 0.367 | 242.078 | 279.904 | 115.018 |
| 2020-07-24-21:03:02 | 154.034 | 0.38 | 242.149 | 279.929 | 114.901 |
| 2020-07-24-21:03:08 | 154.065 | 0.381 | 242.151 | 279.879 | 114.902 |
| 2020-07-24-21:03:14 | 154.015 | 0.341 | 242.101 | 280.005 | 114.923 |
| 2020-07-24-21:03:19 | 153.981 | 0.362 | 242.096 | 279.898 | 115.067 |
| 2020-07-24-21:03:25 | 153.999 | 0.316 | 242.068 | 279.93 | 114.899 |
| 2020-07-24-21:03:31 | 154.109 | 0.397 | 242.23 | 279.855 | 114.912 |
| 2020-07-24-21:03:37 | 154.057 | 0.396 | 242.102 | 279.95 | 114.981 |
| 2020-07-24-21:03:43 | 154.027 | 0.367 | 242.079 | 279.976 | 115.037 |
| 2020-07-24-21:03:48 | 154.088 | 0.325 | 242.254 | 279.96 | 114.98 |
| 2020-07-24-21:03:54 | 154.136 | 0.335 | 242.495 | 279.913 | 114.884 |
| 2020-07-24-21:04:00 | 154.111 | 0.376 | 242.199 | 279.879 | 114.946 |
| 2020-07-24-21:04:06 | 153.981 | 0.376 | 242.717 | 279.92 | 115.084 |
| 2020-07-24-21:04:12 | 154.193 | 0.336 | 242.276 | 279.868 | 114.958 |
| 2020-07-24-21:04:17 | 153.996 | 0.48 | 242.105 | 279.951 | 114.952 |
| 2020-07-24-21:04:23 | 154.043 | 0.343 | 242.171 | 279.861 | 114.962 |
| 2020-07-24-21:04:29 | 153.995 | 0.344 | 242.395 | 279.829 | 114.944 |
| 2020-07-24-21:04:35 | 153.981 | 0.351 | 242.127 | 279.892 | 114.907 |
| 2020-07-24-21:04:41 | 154.038 | 0.352 | 242.194 | 279.92 | 115.012 |
| 2020-07-24-21:04:47 | 154.484 | 0.349 | 242.108 | 279.908 | 114.959 |
| 2020-07-24-21:04:52 | 154.102 | 0.334 | 242.113 | 279.896 | 114.962 |
| 2020-07-24-21:04:58 | 154.124 | 0.299 | 242.139 | 279.903 | 114.926 |
| 2020-07-24-21:05:04 | 154.136 | 0.35 | 242.145 | 279.926 | 114.966 |
| 2020-07-24-21:05:10 | 154.03 | 0.37 | 242.177 | 279.908 | 114.943 |
| 2020-07-24-21:05:16 | 154 | 0.368 | 242.158 | 279.953 | 115.084 |
| 2020-07-24-21:05:21 | 154.038 | 0.303 | 242.137 | 279.893 | 114.96 |
| 2020-07-24-21:05:27 | 153.988 | 0.296 | 242.118 | 279.878 | 114.889 |
| 2020-07-24-21:05:33 | 154.066 | 0.545 | 242.09 | 279.901 | 114.944 |
| 2020-07-24-21:05:39 | 154.017 | 0.328 | 242.108 | 279.875 | 114.981 |
| 2020-07-24-21:05:45 | 154.045 | 0.31 | 242.075 | 279.926 | 114.913 |
| 2020-07-24-21:05:50 | 154.116 | 0.492 | 242.175 | 279.944 | 114.864 |
| 2020-07-24-21:05:56 | 154.072 | 0.378 | 242.145 | 279.943 | 114.889 |
| 2020-07-24-21:06:02 | 154.039 | 0.34 | 242.129 | 279.988 | 114.999 |
| 2020-07-24-21:06:08 | 154.048 | 0.356 | 242.236 | 279.931 | 114.887 |
| 2020-07-24-21:06:14 | 154.103 | 0.359 | 242.113 | 279.977 | 114.98 |
| 2020-07-24-21:06:19 | 154.02 | 0.489 | 242.223 | 279.983 | 114.921 |
| 2020-07-24-21:06:25 | 153.996 | 0.33 | 242.094 | 279.858 | 115.14 |
| 2020-07-24-21:06:31 | 154.022 | 0.333 | 242.091 | 279.927 | 114.966 |
| 2020-07-24-21:06:37 | 153.976 | 0.44 | 242.188 | 279.893 | 114.916 |
| 2020-07-24-21:06:43 | 154.05 | 0.348 | 242.119 | 279.94 | 115.086 |
| 2020-07-24-21:06:48 | 154.027 | 0.395 | 242.101 | 279.919 | 114.901 |
| 2020-07-24-21:06:54 | 154.021 | 0.392 | 242.134 | 279.986 | 114.986 |
| 2020-07-24-21:07:00 | 154.034 | 0.46 | 242.151 | 280.272 | 115.942 |
| 2020-07-24-21:07:06 | 154.033 | 0.405 | 242.174 | 280.334 | 114.941 |
| 2020-07-24-21:07:12 | 154.054 | 0.343 | 242.199 | 279.946 | 114.879 |
| 2020-07-24-21:07:18 | 154.023 | 0.35 | 242.185 | 279.996 | 114.943 |
| 2020-07-24-21:07:23 | 154.055 | 0.38 | 242.162 | 280.048 | 114.951 |
| 2020-07-24-21:07:29 | 154.082 | 0.349 | 242.144 | 279.992 | 114.922 |
| 2020-07-24-21:07:35 | 154.066 | 0.736 | 242.119 | 279.963 | 114.883 |
| 2020-07-24-21:07:41 | 154.081 | 0.323 | 242.225 | 279.948 | 115.341 |
| 2020-07-24-21:07:47 | 153.991 | 0.343 | 242.189 | 280.023 | 114.911 |
| 2020-07-24-21:07:52 | 153.971 | 0.354 | 242.137 | 279.993 | 115.036 |
| 2020-07-24-21:07:58 | 153.992 | 0.326 | 242.125 | 279.914 | 114.885 |
| 2020-07-24-21:08:04 | 154.068 | 0.385 | 242.199 | 280.113 | 114.939 |
| 2020-07-24-21:08:10 | 154.044 | 0.372 | 242.185 | 279.991 | 114.968 |
| 2020-07-24-21:08:16 | 154.006 | 0.373 | 242.071 | 279.978 | 114.989 |
| 2020-07-24-21:08:21 | 153.968 | 0.315 | 242.076 | 279.894 | 115.001 |
| 2020-07-24-21:08:27 | 154.234 | 0.328 | 242.143 | 279.892 | 114.883 |
| 2020-07-24-21:08:33 | 154.022 | 0.315 | 242.087 | 279.921 | 114.915 |
| 2020-07-24-21:08:39 | 153.957 | 0.312 | 242.177 | 279.995 | 114.926 |
| 2020-07-24-21:08:45 | 154.032 | 0.42 | 242.171 | 279.924 | 115.177 |
| 2020-07-24-21:08:50 | 154.032 | 0.351 | 242.113 | 279.938 | 115.021 |
| 2020-07-24-21:08:56 | 154.043 | 0.319 | 242.023 | 279.875 | 114.906 |
| 2020-07-24-21:09:02 | 154.017 | 0.347 | 242.148 | 279.854 | 114.911 |
| 2020-07-24-21:09:08 | 153.969 | 0.329 | 242.125 | 279.87 | 114.966 |
| 2020-07-24-21:09:14 | 154.097 | 0.427 | 242.142 | 280.012 | 114.861 |
| 2020-07-24-21:09:19 | 154.047 | 0.365 | 242.259 | 279.991 | 114.954 |
| 2020-07-24-21:09:25 | 154 | 0.42 | 242.132 | 279.866 | 114.875 |
| 2020-07-24-21:09:31 | 154.052 | 0.369 | 242.921 | 279.936 | 114.952 |
| 2020-07-24-21:09:37 | 154.006 | 0.35 | 242.124 | 279.972 | 114.929 |
| 2020-07-24-21:09:43 | 154.032 | 0.373 | 242.072 | 279.897 | 114.903 |
| 2020-07-24-21:09:49 | 153.995 | 0.354 | 242.094 | 280.059 | 114.904 |
| 2020-07-24-21:09:54 | 154.034 | 0.308 | 242.335 | 279.938 | 114.952 |
| 2020-07-24-21:10:00 | 153.997 | 0.361 | 242.122 | 279.827 | 114.953 |
| 2020-07-24-21:10:06 | 154.002 | 0.367 | 242.517 | 279.871 | 114.911 |
| 2020-07-24-21:10:12 | 154.038 | 0.406 | 242.192 | 279.965 | 114.861 |
| 2020-07-24-21:10:18 | 154.113 | 0.376 | 242.095 | 280.443 | 114.846 |
| 2020-07-24-21:10:23 | 154.03 | 0.315 | 242.088 | 279.9 | 114.959 |
| 2020-07-24-21:10:29 | 155.623 | 0.397 | 242.176 | 279.904 | 114.87 |
| 2020-07-24-21:10:35 | 154.162 | 0.371 | 242.105 | 279.979 | 114.87 |
| 2020-07-24-21:10:41 | 153.978 | 0.33 | 242.114 | 279.843 | 114.826 |
| 2020-07-24-21:10:47 | 154.01 | 0.303 | 242.118 | 279.996 | 114.791 |
| 2020-07-24-21:10:52 | 153.985 | 0.383 | 242.109 | 279.839 | 115.214 |
| 2020-07-24-21:10:58 | 154.024 | 0.372 | 242.127 | 279.974 | 114.866 |
| 2020-07-24-21:11:04 | 154.637 | 0.369 | 242.239 | 280.051 | 114.869 |
| 2020-07-24-21:11:10 | 154.048 | 0.379 | 242.204 | 279.921 | 114.75 |
| 2020-07-24-21:11:16 | 153.497 | 0.329 | 242.14 | 279.944 | 114.85 |
| 2020-07-24-21:11:21 | 153.463 | 0.297 | 242.102 | 279.934 | 114.891 |
| 2020-07-24-21:11:27 | 153.569 | 0.298 | 242.139 | 279.913 | 114.805 |
| 2020-07-24-21:11:33 | 153.529 | 0.397 | 242.159 | 279.967 | 114.854 |
| 2020-07-24-21:11:39 | 153.498 | 0.382 | 242.126 | 279.901 | 114.81 |
| 2020-07-24-21:11:45 | 153.513 | 0.307 | 242.124 | 279.928 | 114.833 |
| 2020-07-24-21:11:50 | 153.498 | 0.521 | 242.223 | 279.926 | 114.804 |
| 2020-07-24-21:11:56 | 153.454 | 0.329 | 242.396 | 279.865 | 114.752 |
| 2020-07-24-21:12:02 | 153.5 | 0.365 | 242.169 | 279.999 | 114.825 |
| 2020-07-24-21:12:08 | 153.511 | 0.396 | 242.205 | 279.916 | 115.22 |
| 2020-07-24-21:12:14 | 153.486 | 0.334 | 242.229 | 279.932 | 114.939 |
| 2020-07-24-21:12:20 | 153.584 | 0.355 | 242.125 | 280.012 | 115.065 |
| 2020-07-24-21:12:25 | 153.519 | 0.348 | 242.267 | 279.898 | 114.937 |
| 2020-07-24-21:12:31 | 153.591 | 0.339 | 242.113 | 279.797 | 114.799 |
| 2020-07-24-21:12:37 | 153.474 | 0.425 | 242.147 | 279.892 | 114.855 |
| 2020-07-24-21:12:43 | 153.494 | 0.348 | 242.236 | 279.843 | 114.825 |
| 2020-07-24-21:12:49 | 153.471 | 0.339 | 242.138 | 279.917 | 114.823 |
| 2020-07-24-21:12:54 | 153.521 | 0.392 | 242.157 | 279.928 | 114.931 |
| 2020-07-24-21:13:00 | 153.441 | 0.311 | 242.199 | 279.874 | 115.682 |
| 2020-07-24-21:13:06 | 153.454 | 0.319 | 242.158 | 279.911 | 114.946 |
| 2020-07-24-21:13:12 | 153.481 | 0.374 | 242.14 | 279.841 | 114.828 |
| 2020-07-24-21:13:18 | 153.517 | 0.424 | 242.093 | 279.887 | 114.896 |
| 2020-07-24-21:13:23 | 153.428 | 0.288 | 242.128 | 279.831 | 114.918 |
| 2020-07-24-21:13:29 | 153.536 | 0.382 | 242.104 | 279.813 | 114.865 |
| 2020-07-24-21:13:35 | 153.534 | 0.294 | 242.087 | 279.854 | 114.895 |
| 2020-07-24-21:13:41 | 153.554 | 0.377 | 242.183 | 279.881 | 114.847 |
| 2020-07-24-21:13:47 | 153.572 | 0.334 | 242.145 | 279.876 | 114.823 |
| 2020-07-24-21:13:52 | 153.464 | 0.362 | 242.111 | 279.915 | 114.923 |
| 2020-07-24-21:13:58 | 153.458 | 0.323 | 242.143 | 279.937 | 114.861 |
| 2020-07-24-21:14:04 | 153.769 | 0.39 | 242.163 | 279.898 | 115.012 |
| 2020-07-24-21:14:10 | 153.531 | 0.452 | 242.173 | 279.873 | 114.928 |
| 2020-07-24-21:14:16 | 153.487 | 0.327 | 242.381 | 279.88 | 114.889 |
| 2020-07-24-21:14:21 | 153.513 | 0.332 | 242.153 | 279.816 | 114.832 |
| 2020-07-24-21:14:27 | 153.576 | 0.372 | 242.056 | 279.891 | 114.938 |
| 2020-07-24-21:14:33 | 153.492 | 0.305 | 242.058 | 279.833 | 114.886 |
| 2020-07-24-21:14:39 | 153.421 | 0.418 | 242.109 | 279.867 | 114.825 |
| 2020-07-24-21:14:45 | 153.464 | 0.357 | 242.161 | 279.926 | 114.904 |
| 2020-07-24-21:14:51 | 153.55 | 0.311 | 242.13 | 279.914 | 114.861 |
| 2020-07-24-21:14:56 | 153.566 | 0.559 | 242.094 | 279.858 | 114.742 |
| 2020-07-24-21:15:02 | 153.583 | 0.336 | 242.103 | 279.901 | 114.898 |
| 2020-07-24-21:15:08 | 153.549 | 0.447 | 242.094 | 280.741 | 114.89 |
| 2020-07-24-21:15:14 | 153.543 | 0.33 | 242.141 | 279.844 | 114.876 |
| 2020-07-24-21:15:20 | 153.569 | 0.672 | 242.086 | 279.934 | 114.777 |
| 2020-07-24-21:15:25 | 153.48 | 0.335 | 242.164 | 279.856 | 114.9 |
| 2020-07-24-21:15:31 | 153.504 | 0.355 | 242.2 | 279.868 | 114.826 |
| 2020-07-24-21:15:37 | 153.547 | 0.298 | 242.31 | 279.82 | 114.872 |
| 2020-07-24-21:15:43 | 153.447 | 0.352 | 242.184 | 279.87 | 114.891 |
| 2020-07-24-21:15:49 | 153.485 | 0.32 | 242.087 | 279.875 | 114.948 |
| 2020-07-24-21:15:54 | 153.563 | 0.379 | 242.159 | 279.853 | 114.905 |
| 2020-07-24-21:16:00 | 153.507 | 0.383 | 242.114 | 279.829 | 114.861 |
| 2020-07-24-21:16:06 | 153.529 | 0.367 | 242.549 | 279.846 | 114.914 |
| 2020-07-24-21:16:12 | 153.483 | 0.408 | 242.189 | 279.831 | 115.229 |
| 2020-07-24-21:16:18 | 153.493 | 0.293 | 242.148 | 279.923 | 114.835 |
| 2020-07-24-21:16:23 | 153.582 | 0.362 | 242.166 | 279.854 | 115.324 |
| 2020-07-24-21:16:29 | 153.4 | 0.296 | 242.178 | 279.873 | 114.894 |
| 2020-07-24-21:16:35 | 153.577 | 0.637 | 242.124 | 279.875 | 114.845 |
| 2020-07-24-21:16:41 | 153.477 | 0.386 | 242.169 | 279.832 | 114.89 |
| 2020-07-24-21:16:47 | 154.575 | 0.357 | 242.163 | 279.912 | 114.774 |
| 2020-07-24-21:16:52 | 153.494 | 0.312 | 242.218 | 279.871 | 115.279 |
| 2020-07-24-21:16:58 | 153.508 | 0.351 | 242.182 | 279.856 | 114.9 |
| 2020-07-24-21:17:04 | 153.596 | 0.329 | 242.197 | 279.874 | 114.793 |
| 2020-07-24-21:17:10 | 153.387 | 0.672 | 242.201 | 279.832 | 114.893 |
| 2020-07-24-21:17:16 | 153.467 | 0.308 | 242.146 | 279.877 | 114.828 |
| 2020-07-24-21:17:21 | 153.476 | 0.377 | 242.096 | 279.875 | 114.856 |
| 2020-07-24-21:17:27 | 153.529 | 1.842 | 242.133 | 279.885 | 114.804 |
| 2020-07-24-21:17:33 | 153.437 | 0.373 | 242.099 | 279.809 | 114.911 |
| 2020-07-24-21:17:39 | 153.437 | 0.3 | 242.223 | 279.885 | 114.935 |
| 2020-07-24-21:17:45 | 153.382 | 0.326 | 242.093 | 279.896 | 114.857 |
| 2020-07-24-21:17:51 | 153.499 | 0.36 | 242.263 | 279.91 | 114.852 |
| 2020-07-24-21:17:56 | 153.451 | 0.335 | 242.169 | 279.822 | 114.895 |
| 2020-07-24-21:18:02 | 153.547 | 0.346 | 242.072 | 279.854 | 114.784 |